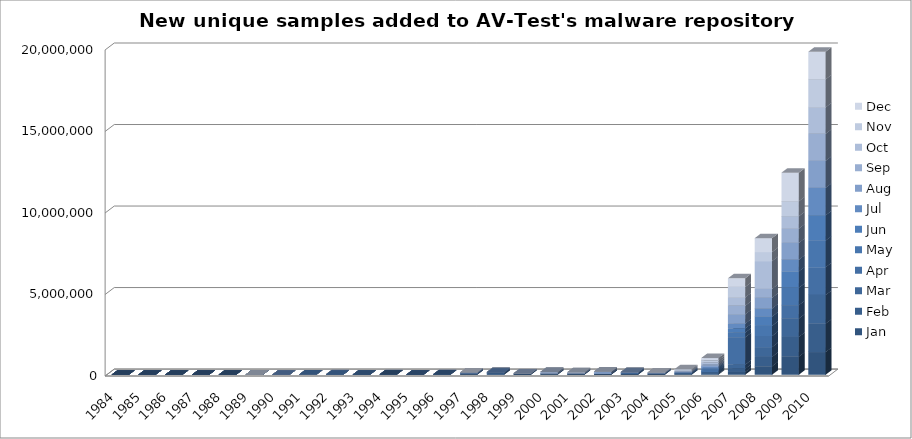
| Category | Jan | Feb | Mar | Apr | May | Jun | Jul | Aug | Sep | Oct | Nov | Dec |
|---|---|---|---|---|---|---|---|---|---|---|---|---|
| 1984.0 | 0 | 0 | 0 | 0 | 0 | 0 | 0 | 0 | 0 | 0 | 0 | 12 |
| 1985.0 | 41 | 23 | 67 | 34 | 53 | 30 | 101 | 33 | 47 | 36 | 60 | 28 |
| 1986.0 | 75 | 34 | 59 | 92 | 39 | 398 | 29 | 20 | 55 | 38 | 43 | 27 |
| 1987.0 | 46 | 31 | 127 | 560 | 42 | 43 | 49 | 45 | 76 | 254 | 51 | 75 |
| 1988.0 | 102 | 133 | 57 | 40 | 47 | 97 | 49 | 757 | 60 | 158 | 115 | 113 |
| 1989.0 | 182 | 258 | 74 | 187 | 161 | 76 | 96 | 98 | 405 | 694 | 249 | 143 |
| 1990.0 | 667 | 264 | 235 | 111 | 181 | 604 | 1302 | 1333 | 579 | 189 | 2792 | 770 |
| 1991.0 | 263 | 659 | 339 | 583 | 10993 | 445 | 1095 | 2130 | 543 | 635 | 556 | 145 |
| 1992.0 | 481 | 412 | 451 | 350 | 3385 | 1878 | 314 | 2686 | 295 | 18653 | 6416 | 1497 |
| 1993.0 | 873 | 627 | 813 | 878 | 1731 | 806 | 2764 | 540 | 1834 | 468 | 393 | 571 |
| 1994.0 | 9424 | 681 | 2840 | 2116 | 908 | 922 | 2725 | 2314 | 2497 | 2132 | 1112 | 954 |
| 1995.0 | 1923 | 783 | 655 | 882 | 1405 | 963 | 1501 | 1696 | 2270 | 1635 | 1153 | 1108 |
| 1996.0 | 1494 | 8492 | 1328 | 851 | 876 | 6024 | 1254 | 3707 | 4177 | 1704 | 3443 | 3472 |
| 1997.0 | 9318 | 3805 | 14774 | 9059 | 21723 | 5116 | 15394 | 26846 | 2421 | 9020 | 14863 | 5467 |
| 1998.0 | 11767 | 3399 | 58160 | 11208 | 17247 | 24978 | 3463 | 14035 | 10129 | 13269 | 4027 | 5853 |
| 1999.0 | 2569 | 12925 | 3215 | 13657 | 6550 | 5729 | 11332 | 13322 | 6471 | 3384 | 4363 | 14994 |
| 2000.0 | 13071 | 5280 | 12265 | 11863 | 2857 | 4889 | 21112 | 5481 | 80400 | 9594 | 3993 | 5507 |
| 2001.0 | 6694 | 14476 | 7036 | 11700 | 10371 | 5764 | 8062 | 16578 | 10789 | 34571 | 23175 | 6345 |
| 2002.0 | 6639 | 5391 | 9559 | 6153 | 7671 | 11909 | 6153 | 109834 | 16537 | 9686 | 6146 | 3380 |
| 2003.0 | 4921 | 9425 | 19351 | 24779 | 24145 | 25845 | 26270 | 7213 | 13338 | 6317 | 7429 | 9748 |
| 2004.0 | 8419 | 7086 | 12935 | 9912 | 10313 | 13734 | 11433 | 26691 | 7933 | 10819 | 9867 | 13260 |
| 2005.0 | 14059 | 14520 | 20491 | 20472 | 23996 | 22634 | 26303 | 30949 | 28498 | 37413 | 45873 | 48599 |
| 2006.0 | 55521 | 51452 | 50765 | 84803 | 69615 | 65887 | 91083 | 84997 | 87596 | 110072 | 131087 | 140019 |
| 2007.0 | 177615 | 194864 | 251434 | 1680631 | 290333 | 255045 | 292326 | 569838 | 527610 | 511153 | 638560 | 528090 |
| 2008.0 | 523496 | 580657 | 595260 | 677689 | 627738 | 569052 | 494452 | 656722 | 544217 | 1703594 | 554564 | 851491 |
| 2009.0 | 1118143 | 1207723 | 1128012 | 817248 | 1070530 | 1003433 | 716220 | 1033857 | 872861 | 758368 | 919858 | 1750581 |
| 2010.0 | 1394649 | 1743360 | 1761740 | 1703059 | 1627090 | 1561570 | 1678434 | 1654758 | 1661375 | 1619500 | 1723810 | 1684887 |